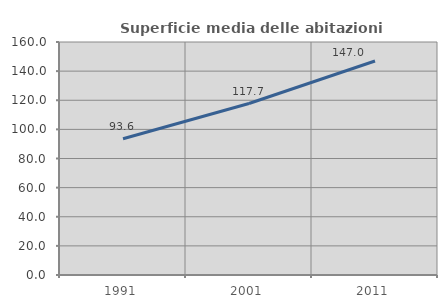
| Category | Superficie media delle abitazioni occupate |
|---|---|
| 1991.0 | 93.603 |
| 2001.0 | 117.739 |
| 2011.0 | 146.982 |